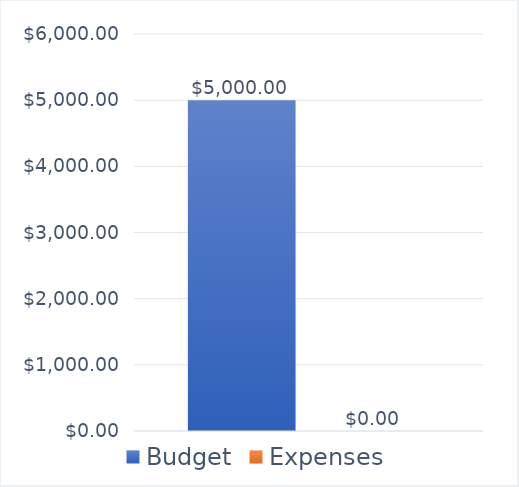
| Category | Budget | Expenses |
|---|---|---|
| 0 | 5000 | 0 |